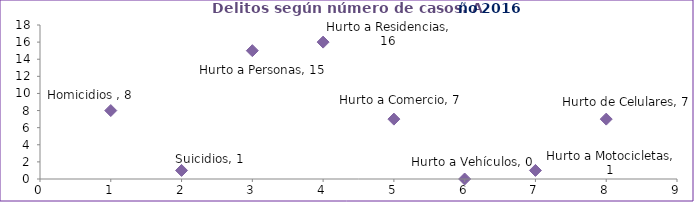
| Category | Series 0 |
|---|---|
| 0 | 8 |
| 1 | 1 |
| 2 | 15 |
| 3 | 16 |
| 4 | 7 |
| 5 | 0 |
| 6 | 1 |
| 7 | 7 |